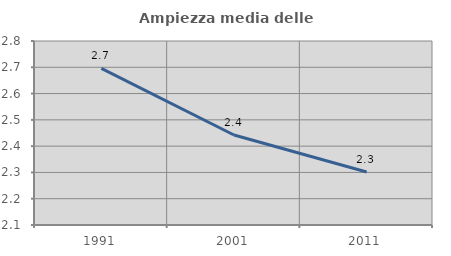
| Category | Ampiezza media delle famiglie |
|---|---|
| 1991.0 | 2.696 |
| 2001.0 | 2.443 |
| 2011.0 | 2.302 |